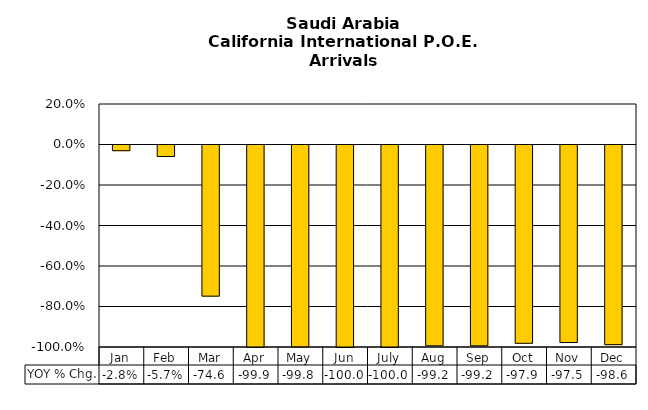
| Category | YOY % Chg. |
|---|---|
| Jan | -0.028 |
| Feb | -0.057 |
| Mar | -0.746 |
| Apr | -0.999 |
| May | -0.998 |
| Jun | -1 |
| July | -1 |
| Aug | -0.992 |
| Sep | -0.992 |
| Oct | -0.979 |
| Nov | -0.975 |
| Dec | -0.986 |